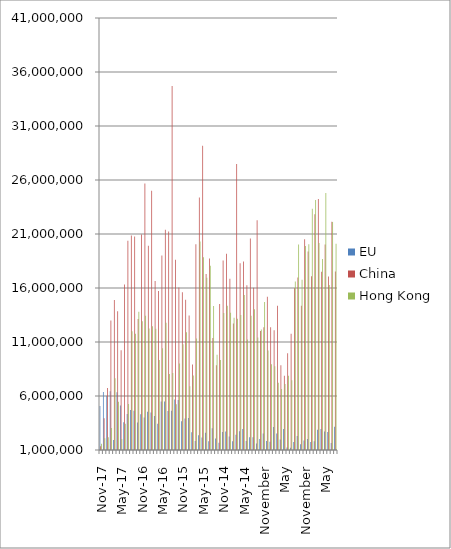
| Category | EU | China  | Hong Kong |
|---|---|---|---|
| Nov-17 | 5064111 | 1340655 | 1581815 |
| Oct-17 | 6378656 | 3937218 | 2096857 |
| Sep-17 | 6021468 | 6735842 | 2183512 |
| Aug-17 | 6436902 | 12986863 | 3038463 |
| Jul-17 | 1917806 | 14879464 | 7636089 |
| Jun-17 | 6344826 | 13836510 | 5463022 |
| May-17 | 5126138 | 10244233 | 2025983 |
| Apr-17 | 3563463 | 16314413 | 3427824 |
| Mar-17 | 4328398 | 20367409 | 5250119 |
| Feb-17 | 4705418 | 20856796 | 11996360 |
| Jan-17 | 4634122 | 20775379 | 11755312 |
| Dec-16 | 3535115 | 13127387 | 13792252 |
| Nov-16 | 4301122 | 20944692 | 12916602 |
| Oct-16 | 4009896 | 25665367 | 13424572 |
| Sep-16 | 4547373 | 19921087 | 12247285 |
| Aug-16 | 4482766 | 25011782 | 12467899 |
| Jul-16 | 4142050 | 16654538 | 12216421 |
| Jun-16 | 3425673 | 15723868 | 9328502 |
| May-16 | 5481026 | 19011945 | 10417586 |
| Apr-16 | 5493103 | 21389069 | 12783949 |
| Mar-16 | 4601443 | 21238180 | 8045193 |
| Feb-16 | 4645301 | 34692799 | 8127956 |
| Jan-16 | 5676253 | 18609369 | 5225585 |
| Dec-15 | 5633739 | 16050304 | 9001127 |
| Nov-15 | 3653595 | 15614028 | 10782451 |
| Oct-15 | 3908135 | 14920598 | 11902041 |
| Sep-15 | 3955053 | 13444791 | 6900644 |
| Aug-15 | 2638287 | 8928230 | 7899961 |
| Jul-15 | 1839630 | 20053716 | 11332757 |
| Jun-15 | 2372118 | 24372058 | 20316047 |
| May-15 | 2146207 | 29168948 | 18849426 |
| Apr-15 | 2592527 | 17297919 | 16950664 |
| Mar-15 | 1804966 | 18722752 | 18054918 |
| Feb-15 | 3005880 | 11376464 | 14338410 |
| Jan-15 | 2059966 | 8839333 | 9816039 |
| Dec-14 | 1677897 | 14508829 | 9323814 |
| Nov-14 | 2675499 | 18543154 | 13696052 |
| Oct-14 | 2703857 | 19160159 | 14362342 |
| Sep-14 | 2241750 | 16855315 | 13708458 |
| Aug-14 | 1815307 | 12701698 | 13256803 |
| Jul-14 | 2408775 | 27492198 | 13141519 |
| Jun-14 | 2725218 | 18285335 | 13501334 |
| May-14 | 2933629 | 18458321 | 15359218 |
| Apr-14 | 1843773 | 16250633 | 11228546 |
| Mar-14 | 2175062 | 20583564 | 13424681 |
| February | 2172031 | 16014877 | 14029194 |
| January | 1603480 | 22273760 | 11421386 |
| December | 2012804 | 12029832 | 12159071 |
| November | 2530866 | 12376993 | 14713711 |
| October | 1837905 | 15196883 | 10219057 |
| September | 1770759 | 12360450 | 8946295 |
| August | 3120814 | 12084187 | 8751947 |
| July | 2519362 | 14352211 | 7223925 |
| June | 1965766 | 8857868 | 6643899 |
| May | 2948266 | 7883665 | 7119069 |
| April | 1236272 | 9949309 | 7867921 |
| March | 1197755 | 11759283 | 7455678 |
| February | 1735231 | 15979037 | 16606797 |
| January | 2302749 | 16965223 | 20019240 |
| December | 1530842 | 14355344 | 16759339 |
| November | 1888182 | 20506929 | 19886975 |
| October | 2024671 | 19383048 | 20052240 |
| September | 1737652 | 17096567 | 23328052 |
| August | 1800761 | 22838535 | 24156982 |
| July | 2872365 | 24232305 | 20164613 |
| June | 2951500 | 17514033 | 18682448 |
| May | 2721121 | 20020969 | 24805010 |
| April | 2657795 | 17058664 | 16281296 |
| March | 1655906 | 22125422 | 22106222 |
| February | 3144860 | 17530823 | 20087977 |